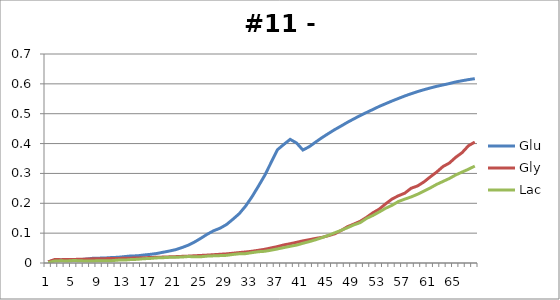
| Category | Glu | Gly | Lac |
|---|---|---|---|
| 0 | 0.003 | 0.004 | 0.002 |
| 1 | 0.01 | 0.012 | 0.006 |
| 2 | 0.01 | 0.011 | 0.007 |
| 3 | 0.009 | 0.012 | 0.007 |
| 4 | 0.01 | 0.012 | 0.008 |
| 5 | 0.012 | 0.012 | 0.008 |
| 6 | 0.013 | 0.013 | 0.006 |
| 7 | 0.016 | 0.014 | 0.007 |
| 8 | 0.016 | 0.014 | 0.008 |
| 9 | 0.017 | 0.015 | 0.007 |
| 10 | 0.018 | 0.015 | 0.008 |
| 11 | 0.019 | 0.015 | 0.01 |
| 12 | 0.021 | 0.016 | 0.01 |
| 13 | 0.024 | 0.016 | 0.012 |
| 14 | 0.024 | 0.017 | 0.012 |
| 15 | 0.027 | 0.018 | 0.014 |
| 16 | 0.029 | 0.018 | 0.015 |
| 17 | 0.032 | 0.019 | 0.017 |
| 18 | 0.036 | 0.02 | 0.018 |
| 19 | 0.04 | 0.021 | 0.019 |
| 20 | 0.045 | 0.021 | 0.019 |
| 21 | 0.052 | 0.022 | 0.02 |
| 22 | 0.06 | 0.023 | 0.022 |
| 23 | 0.07 | 0.024 | 0.021 |
| 24 | 0.083 | 0.025 | 0.021 |
| 25 | 0.097 | 0.026 | 0.023 |
| 26 | 0.108 | 0.028 | 0.024 |
| 27 | 0.117 | 0.029 | 0.025 |
| 28 | 0.129 | 0.031 | 0.026 |
| 29 | 0.146 | 0.033 | 0.029 |
| 30 | 0.165 | 0.035 | 0.031 |
| 31 | 0.191 | 0.037 | 0.031 |
| 32 | 0.222 | 0.039 | 0.035 |
| 33 | 0.257 | 0.043 | 0.038 |
| 34 | 0.293 | 0.046 | 0.039 |
| 35 | 0.336 | 0.05 | 0.043 |
| 36 | 0.379 | 0.055 | 0.047 |
| 37 | 0.397 | 0.06 | 0.052 |
| 38 | 0.414 | 0.065 | 0.056 |
| 39 | 0.402 | 0.069 | 0.06 |
| 40 | 0.378 | 0.074 | 0.066 |
| 41 | 0.39 | 0.078 | 0.072 |
| 42 | 0.405 | 0.082 | 0.078 |
| 43 | 0.42 | 0.086 | 0.085 |
| 44 | 0.434 | 0.091 | 0.093 |
| 45 | 0.447 | 0.098 | 0.101 |
| 46 | 0.459 | 0.109 | 0.109 |
| 47 | 0.471 | 0.122 | 0.118 |
| 48 | 0.483 | 0.13 | 0.128 |
| 49 | 0.494 | 0.14 | 0.135 |
| 50 | 0.504 | 0.153 | 0.149 |
| 51 | 0.514 | 0.168 | 0.159 |
| 52 | 0.525 | 0.181 | 0.171 |
| 53 | 0.534 | 0.198 | 0.183 |
| 54 | 0.543 | 0.214 | 0.193 |
| 55 | 0.551 | 0.225 | 0.206 |
| 56 | 0.559 | 0.234 | 0.214 |
| 57 | 0.567 | 0.25 | 0.221 |
| 58 | 0.574 | 0.258 | 0.23 |
| 59 | 0.58 | 0.271 | 0.241 |
| 60 | 0.586 | 0.288 | 0.251 |
| 61 | 0.592 | 0.304 | 0.263 |
| 62 | 0.596 | 0.323 | 0.273 |
| 63 | 0.601 | 0.335 | 0.283 |
| 64 | 0.606 | 0.354 | 0.295 |
| 65 | 0.61 | 0.37 | 0.305 |
| 66 | 0.614 | 0.393 | 0.314 |
| 67 | 0.617 | 0.405 | 0.325 |